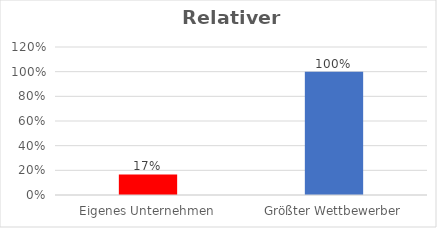
| Category | Series 0 |
|---|---|
| Eigenes Unternehmen | 0.167 |
| Größter Wettbewerber | 1 |